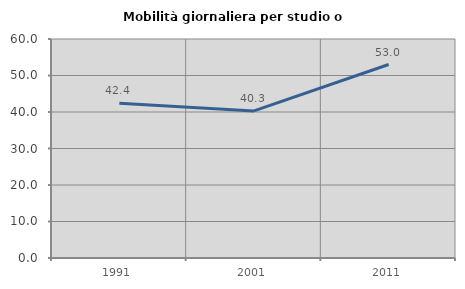
| Category | Mobilità giornaliera per studio o lavoro |
|---|---|
| 1991.0 | 42.421 |
| 2001.0 | 40.291 |
| 2011.0 | 53.012 |